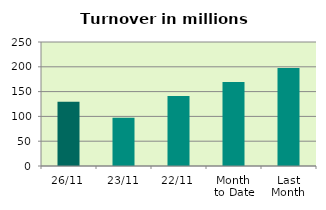
| Category | Series 0 |
|---|---|
| 26/11 | 129.648 |
| 23/11 | 97.066 |
| 22/11 | 141.315 |
| Month 
to Date | 169.478 |
| Last
Month | 197.652 |